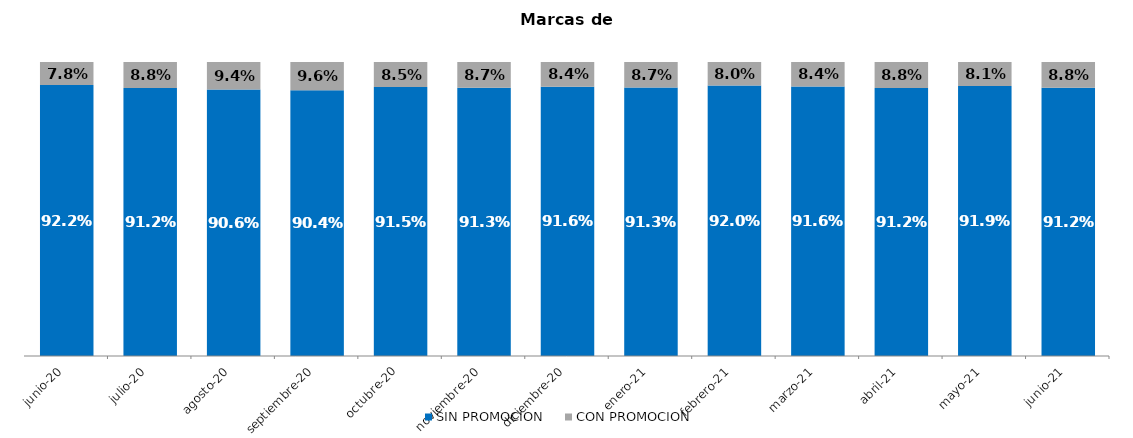
| Category | SIN PROMOCION   | CON PROMOCION   |
|---|---|---|
| 2020-06-01 | 0.922 | 0.078 |
| 2020-07-01 | 0.912 | 0.088 |
| 2020-08-01 | 0.906 | 0.094 |
| 2020-09-01 | 0.904 | 0.096 |
| 2020-10-01 | 0.915 | 0.085 |
| 2020-11-01 | 0.913 | 0.087 |
| 2020-12-01 | 0.916 | 0.084 |
| 2021-01-01 | 0.913 | 0.087 |
| 2021-02-01 | 0.92 | 0.08 |
| 2021-03-01 | 0.916 | 0.084 |
| 2021-04-01 | 0.912 | 0.088 |
| 2021-05-01 | 0.919 | 0.081 |
| 2021-06-01 | 0.912 | 0.088 |